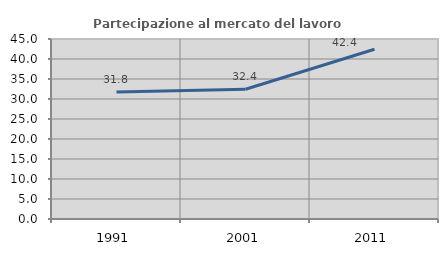
| Category | Partecipazione al mercato del lavoro  femminile |
|---|---|
| 1991.0 | 31.755 |
| 2001.0 | 32.447 |
| 2011.0 | 42.424 |